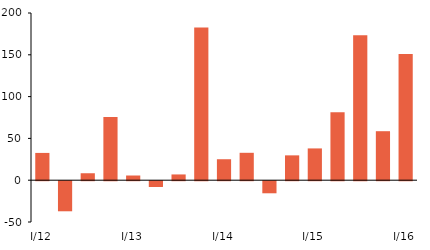
| Category | Series 1 |
|---|---|
| I/12 | 32.632 |
| II | -35.982 |
| III | 8.321 |
| IV | 75.502 |
| I/13 | 5.61 |
| II | -6.912 |
| III | 6.889 |
| IV | 182.604 |
| I/14 | 25.08 |
| II | 32.776 |
| III | -14.448 |
| IV | 29.714 |
| I/15 | 38.01 |
| II | 81.243 |
| III | 173.44 |
| IV | 58.612 |
| I/16 | 150.883 |